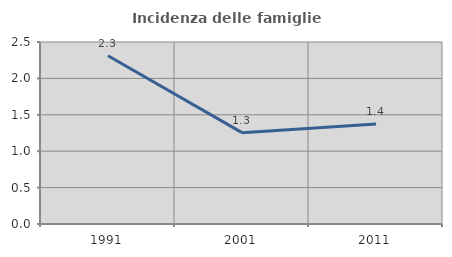
| Category | Incidenza delle famiglie numerose |
|---|---|
| 1991.0 | 2.312 |
| 2001.0 | 1.255 |
| 2011.0 | 1.375 |